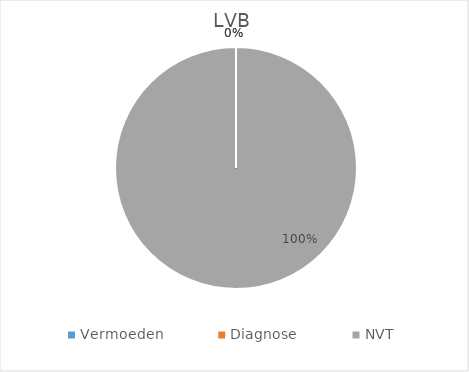
| Category | Series 0 |
|---|---|
| Vermoeden | 0 |
| Diagnose | 0 |
| NVT | 1 |